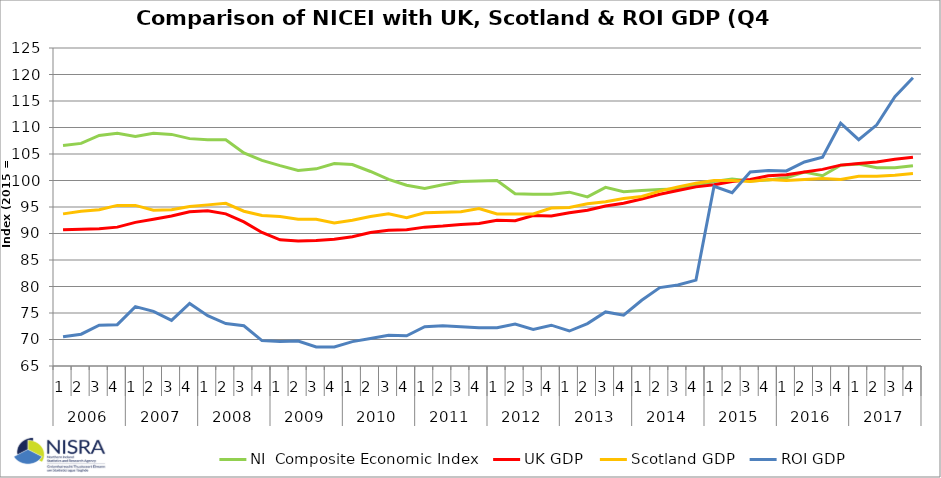
| Category | NI  | UK | Scotland | ROI |
|---|---|---|---|---|
| 0 | 106.6 | 90.7 | 93.7 | 70.5 |
| 1 | 107 | 90.8 | 94.2 | 71 |
| 2 | 108.5 | 90.9 | 94.5 | 72.7 |
| 3 | 108.9 | 91.2 | 95.3 | 72.8 |
| 4 | 108.3 | 92.1 | 95.3 | 76.2 |
| 5 | 108.9 | 92.7 | 94.4 | 75.3 |
| 6 | 108.7 | 93.3 | 94.5 | 73.6 |
| 7 | 107.9 | 94.1 | 95.1 | 76.8 |
| 8 | 107.7 | 94.3 | 95.4 | 74.5 |
| 9 | 107.7 | 93.7 | 95.7 | 73 |
| 10 | 105.2 | 92.2 | 94.2 | 72.6 |
| 11 | 103.8 | 90.2 | 93.4 | 69.8 |
| 12 | 102.8 | 88.8 | 93.2 | 69.6 |
| 13 | 101.9 | 88.6 | 92.7 | 69.7 |
| 14 | 102.2 | 88.7 | 92.7 | 68.6 |
| 15 | 103.2 | 88.9 | 92 | 68.6 |
| 16 | 103 | 89.4 | 92.5 | 69.6 |
| 17 | 101.7 | 90.2 | 93.2 | 70.2 |
| 18 | 100.2 | 90.6 | 93.7 | 70.8 |
| 19 | 99.1 | 90.7 | 93 | 70.7 |
| 20 | 98.5 | 91.2 | 93.9 | 72.4 |
| 21 | 99.2 | 91.4 | 94 | 72.6 |
| 22 | 99.8 | 91.7 | 94.1 | 72.4 |
| 23 | 99.9 | 91.9 | 94.7 | 72.2 |
| 24 | 100 | 92.5 | 93.7 | 72.2 |
| 25 | 97.5 | 92.4 | 93.7 | 72.9 |
| 26 | 97.4 | 93.4 | 93.7 | 71.9 |
| 27 | 97.4 | 93.3 | 94.8 | 72.7 |
| 28 | 97.8 | 93.9 | 94.9 | 71.6 |
| 29 | 96.9 | 94.4 | 95.6 | 73 |
| 30 | 98.7 | 95.2 | 96 | 75.2 |
| 31 | 97.9 | 95.7 | 96.6 | 74.6 |
| 32 | 98.1 | 96.5 | 97 | 77.4 |
| 33 | 98.3 | 97.4 | 98 | 79.8 |
| 34 | 98.4 | 98.1 | 98.8 | 80.3 |
| 35 | 99.1 | 98.8 | 99.5 | 81.2 |
| 36 | 99.8 | 99.2 | 100 | 98.9 |
| 37 | 100.3 | 99.8 | 100 | 97.7 |
| 38 | 99.9 | 100.2 | 99.8 | 101.6 |
| 39 | 100.1 | 100.9 | 100.2 | 101.9 |
| 40 | 100.5 | 101.1 | 100 | 101.8 |
| 41 | 101.6 | 101.6 | 100.2 | 103.5 |
| 42 | 100.9 | 102.1 | 100.4 | 104.4 |
| 43 | 102.9 | 102.9 | 100.2 | 110.8 |
| 44 | 103.1 | 103.2 | 100.8 | 107.7 |
| 45 | 102.4 | 103.5 | 100.8 | 110.5 |
| 46 | 102.4 | 104 | 101 | 115.8 |
| 47 | 102.8 | 104.4 | 101.3 | 119.4 |